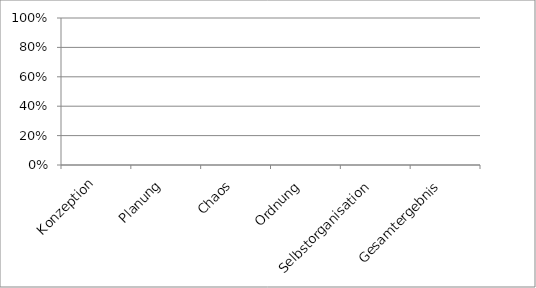
| Category | Series 0 |
|---|---|
| Konzeption | 0 |
| Planung | 0 |
| Chaos | 0 |
| Ordnung | 0 |
| Selbstorganisation | 0 |
| Gesamtergebnis | 0 |